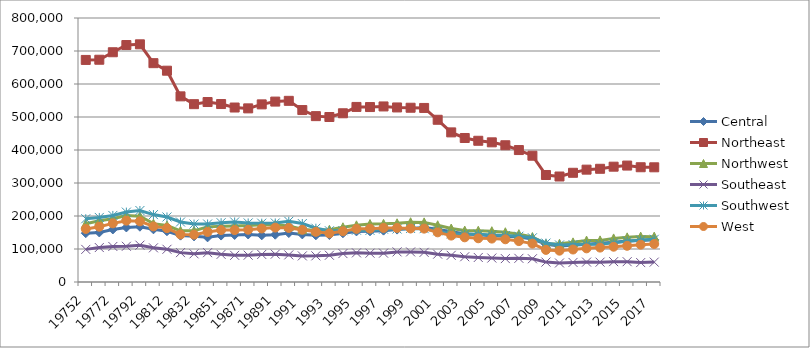
| Category | Central | Northeast | Northwest | Southeast | Southwest | West |
|---|---|---|---|---|---|---|
| 19752 | 147881 | 672956 | 176574 | 98832 | 191687 | 160779 |
| 19762 | 150170 | 673503 | 185487 | 104425 | 195623 | 167564 |
| 19772 | 159257 | 696228 | 191932 | 107706 | 201733 | 177709 |
| 19782 | 165317 | 718056 | 201622 | 108237 | 211819 | 185839 |
| 19792 | 167570 | 720251 | 199422 | 111644 | 216623 | 183807 |
| 19802 | 159655 | 663119 | 176743 | 103544 | 204257 | 168483 |
| 19812 | 153805 | 640340 | 171276 | 99158 | 197048 | 163228 |
| 19822 | 140509 | 562548 | 155225 | 89022 | 181748 | 144200 |
| 19832 | 138276 | 538878 | 155374 | 85329 | 175634 | 143447 |
| 19841 | 135285 | 545371 | 167064 | 88902 | 175880 | 151553 |
| 19851 | 140724 | 539287 | 169116 | 83835 | 179628 | 157292 |
| 19861 | 142538 | 528740 | 170024 | 80782 | 181891 | 157292 |
| 19871 | 144055 | 526137 | 170993 | 81257 | 178985 | 158365 |
| 19881 | 141473 | 538270 | 173670 | 83566 | 178287 | 162192 |
| 19891 | 143298 | 546702 | 173377 | 84332 | 178853 | 164839 |
| 1990 | 148380 | 548979 | 169849 | 82120 | 184026 | 163886 |
| 1991 | 144183 | 521031 | 159762 | 79116 | 177132 | 158302 |
| 1992 | 141535 | 502614 | 156354 | 79222 | 162988 | 151979 |
| 1993 | 142439 | 499984 | 158278 | 81082 | 155236 | 147434 |
| 1994 | 147691 | 511294 | 165830 | 86152 | 155358 | 153867 |
| 1995 | 153303 | 530532 | 171756 | 88281 | 156986 | 161044 |
| 1996 | 153708 | 530138 | 175708 | 87351 | 156426 | 161626 |
| 1997 | 155651 | 532003 | 176283 | 87492 | 160009 | 163798 |
| 1998 | 158784 | 528934 | 177974 | 91248 | 160593 | 163903 |
| 1999 | 161757 | 528050 | 181050 | 91121 | 162209 | 162198 |
| 2000 | 165446 | 527454 | 180676 | 89894 | 161605 | 161786 |
| 2001 | 159959 | 491579 | 171895 | 84358 | 154805 | 150467 |
| 2002 | 152141 | 453364 | 162108 | 80832 | 145849 | 140653 |
| 2003 | 146527 | 436372 | 155744 | 76518 | 144752 | 135408 |
| 2004 | 143321 | 427948 | 155328 | 74331 | 144684 | 132516 |
| 2005 | 140117 | 423244 | 153914 | 72611 | 142274 | 131570 |
| 2006 | 138938 | 414376 | 150754 | 70891 | 140659 | 129438 |
| 2007 | 136357 | 399811 | 145003 | 71717 | 138728 | 123889 |
| 2008 | 130517 | 382684 | 136351 | 70434 | 133973 | 116309 |
| 2009 | 114074 | 324246 | 115136 | 60352 | 117893 | 97251 |
| 2010 | 108772 | 319676 | 115811 | 57629 | 112286 | 94879 |
| 2011 | 111122 | 330948 | 120122 | 59308 | 113419 | 98454 |
| 2012 | 114174 | 340442 | 125447 | 60332 | 114033 | 101972 |
| 2013 | 117690 | 343079 | 126117 | 60100 | 114080 | 104288 |
| 2014 | 120268 | 349449 | 132089 | 61687 | 118561 | 106917 |
| 2015 | 124044 | 352811 | 135299 | 61530 | 123776 | 109740 |
| 2016 | 126065 | 347758 | 137574 | 58851 | 127322 | 113173 |
| 2017 | 128038 | 347572 | 137454 | 60252 | 129433 | 115277 |